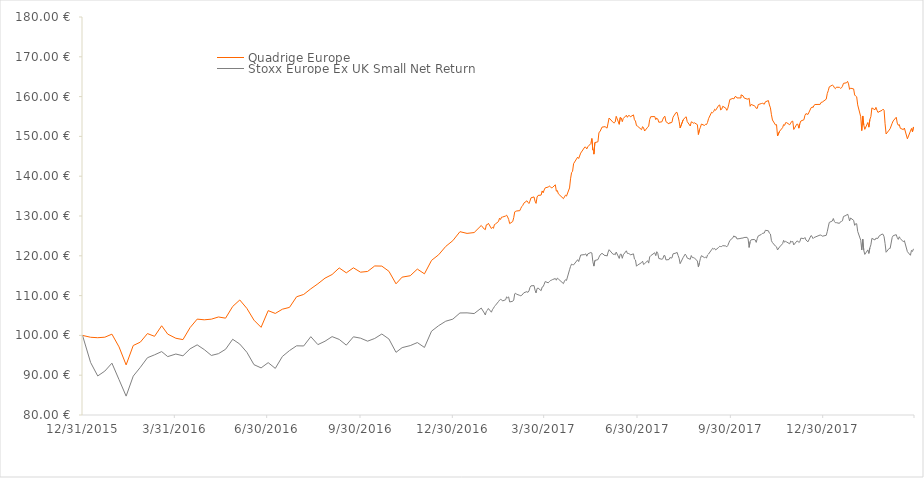
| Category |  Quadrige Europe     |  Stoxx Europe Ex UK Small Net Return  |
|---|---|---|
| 12/31/15 | 100 | 100 |
| 1/8/16 | 99.53 | 93.186 |
| 1/15/16 | 99.42 | 89.81 |
| 1/22/16 | 99.55 | 91.035 |
| 1/29/16 | 100.31 | 93.024 |
| 2/5/16 | 97.11 | 88.883 |
| 2/12/16 | 92.59 | 84.746 |
| 2/19/16 | 97.46 | 89.771 |
| 2/26/16 | 98.31 | 91.98 |
| 3/4/16 | 100.46 | 94.39 |
| 3/11/16 | 99.77 | 95.116 |
| 3/18/16 | 102.42 | 95.935 |
| 3/24/16 | 100.32 | 94.673 |
| 4/1/16 | 99.28 | 95.319 |
| 4/8/16 | 98.94 | 94.872 |
| 4/15/16 | 101.95 | 96.62 |
| 4/22/16 | 104.09 | 97.627 |
| 4/29/16 | 103.92 | 96.434 |
| 5/6/16 | 104.08 | 94.964 |
| 5/13/16 | 104.63 | 95.412 |
| 5/20/16 | 104.33 | 96.51 |
| 5/27/16 | 107.27 | 99.025 |
| 6/3/16 | 108.9 | 97.822 |
| 6/10/16 | 106.78 | 95.755 |
| 6/17/16 | 103.83 | 92.646 |
| 6/24/16 | 102.03 | 91.833 |
| 7/1/16 | 106.22 | 93.156 |
| 7/8/16 | 105.52 | 91.714 |
| 7/15/16 | 106.58 | 94.707 |
| 7/22/16 | 107.04 | 96.186 |
| 7/29/16 | 109.71 | 97.385 |
| 8/5/16 | 110.29 | 97.348 |
| 8/12/16 | 111.7 | 99.682 |
| 8/19/16 | 112.97 | 97.683 |
| 8/26/16 | 114.38 | 98.537 |
| 9/2/16 | 115.3 | 99.693 |
| 9/9/16 | 116.95 | 98.993 |
| 9/16/16 | 115.72 | 97.554 |
| 9/23/16 | 116.98 | 99.646 |
| 9/30/16 | 115.88 | 99.306 |
| 10/7/16 | 116.07 | 98.55 |
| 10/14/16 | 117.45 | 99.231 |
| 10/21/16 | 117.41 | 100.348 |
| 10/28/16 | 116.11 | 99.094 |
| 11/4/16 | 112.96 | 95.749 |
| 11/10/16 | 114.64 | 96.922 |
| 11/18/16 | 114.99 | 97.437 |
| 11/25/16 | 116.66 | 98.2 |
| 12/2/16 | 115.47 | 96.974 |
| 12/9/16 | 118.85 | 101.063 |
| 12/16/16 | 120.26 | 102.444 |
| 12/23/16 | 122.36 | 103.564 |
| 12/30/16 | 123.81 | 104.089 |
| 1/6/17 | 126.06 | 105.639 |
| 1/13/17 | 125.63 | 105.667 |
| 1/20/17 | 125.84 | 105.481 |
| 1/27/17 | 127.62 | 106.868 |
| 1/30/17 | 126.7 | 105.623 |
| 1/31/17 | 126.57 | 105.126 |
| 2/1/17 | 127.78 | 106.058 |
| 2/2/17 | 127.81 | 106.291 |
| 2/3/17 | 128.17 | 106.762 |
| 2/6/17 | 126.85 | 105.827 |
| 2/7/17 | 127.16 | 106.445 |
| 2/8/17 | 126.91 | 106.819 |
| 2/9/17 | 127.85 | 107.249 |
| 2/10/17 | 128 | 107.558 |
| 2/13/17 | 128.62 | 108.502 |
| 2/14/17 | 129.45 | 108.857 |
| 2/15/17 | 129.13 | 109.04 |
| 2/16/17 | 129.71 | 108.969 |
| 2/17/17 | 129.74 | 108.658 |
| 2/20/17 | 130 | 108.958 |
| 2/21/17 | 130.21 | 109.684 |
| 2/22/17 | 129.76 | 109.459 |
| 2/23/17 | 129.15 | 109.671 |
| 2/24/17 | 128.09 | 108.407 |
| 2/27/17 | 128.61 | 108.57 |
| 2/28/17 | 129.59 | 108.9 |
| 3/1/17 | 131.04 | 110.46 |
| 3/2/17 | 131.18 | 110.56 |
| 3/3/17 | 131.27 | 110.33 |
| 3/6/17 | 131.34 | 110.05 |
| 3/7/17 | 131.94 | 109.95 |
| 3/8/17 | 132.4 | 110.1 |
| 3/9/17 | 132.69 | 110.4 |
| 3/10/17 | 133.23 | 110.71 |
| 3/13/17 | 133.82 | 111 |
| 3/14/17 | 133.45 | 110.8 |
| 3/15/17 | 133.14 | 111.16 |
| 3/16/17 | 133.75 | 112.04 |
| 3/17/17 | 134.56 | 112.45 |
| 3/20/17 | 134.8 | 112.52 |
| 3/21/17 | 133.73 | 111.36 |
| 3/22/17 | 133.17 | 110.66 |
| 3/23/17 | 134.76 | 111.78 |
| 3/24/17 | 135.17 | 111.89 |
| 3/27/17 | 135.25 | 111.24 |
| 3/28/17 | 136.3 | 112.14 |
| 3/29/17 | 135.83 | 112.25 |
| 3/30/17 | 136.54 | 112.84 |
| 3/31/17 | 137.07 | 113.53 |
| 4/3/17 | 137.28 | 113.21 |
| 4/4/17 | 137.52 | 113.49 |
| 4/5/17 | 137.4 | 113.75 |
| 4/6/17 | 137.08 | 113.85 |
| 4/7/17 | 137.12 | 114 |
| 4/10/17 | 137.84 | 114.29 |
| 4/11/17 | 136.25 | 113.87 |
| 4/12/17 | 136.38 | 114.4 |
| 4/13/17 | 135.57 | 114.17 |
| 4/18/17 | 134.36 | 113.01 |
| 4/19/17 | 134.8 | 113.64 |
| 4/20/17 | 135.23 | 113.99 |
| 4/21/17 | 135 | 113.81 |
| 4/24/17 | 137.05 | 116.49 |
| 4/25/17 | 139.34 | 117.33 |
| 4/26/17 | 140.88 | 117.91 |
| 4/27/17 | 141.24 | 117.78 |
| 4/28/17 | 143.14 | 117.72 |
| 5/2/17 | 144.79 | 119.02 |
| 5/3/17 | 144.45 | 118.56 |
| 5/5/17 | 145.8 | 120.19 |
| 5/9/17 | 147.32 | 120.31 |
| 5/10/17 | 147.28 | 120.49 |
| 5/11/17 | 146.85 | 119.9 |
| 5/12/17 | 147.39 | 120.47 |
| 5/15/17 | 148.21 | 120.83 |
| 5/16/17 | 149.47 | 120.71 |
| 5/17/17 | 146.55 | 118.52 |
| 5/17/17 | 146.55 | 118.52 |
| 5/18/17 | 146.55 | 117.41 |
| 5/18/17 | 146.55 | 117.41 |
| 5/18/17 | 145.54 | 117.41 |
| 5/19/17 | 148.45 | 118.82 |
| 5/22/17 | 148.65 | 119.04 |
| 5/23/17 | 151 | 119.65 |
| 5/24/17 | 151.19 | 120.17 |
| 5/26/17 | 152.33 | 120.63 |
| 5/29/17 | 152.45 | 120.01 |
| 5/30/17 | 152.26 | 120.15 |
| 5/31/17 | 152.08 | 119.9 |
| 6/1/17 | 153.35 | 120.89 |
| 6/2/17 | 154.62 | 121.53 |
| 6/6/17 | 153.5 | 120.35 |
| 6/7/17 | 153.38 | 120.46 |
| 6/8/17 | 153.63 | 120.25 |
| 6/9/17 | 155.05 | 120.94 |
| 6/12/17 | 153.04 | 119.34 |
| 6/13/17 | 154.75 | 120.4 |
| 6/14/17 | 154.63 | 120.39 |
| 6/15/17 | 153.7 | 119.37 |
| 6/16/17 | 154.51 | 120.25 |
| 6/19/17 | 155.31 | 121.26 |
| 6/20/17 | 154.8 | 120.61 |
| 6/21/17 | 155.22 | 120.58 |
| 6/22/17 | 155.25 | 120.53 |
| 6/23/17 | 154.92 | 120.22 |
| 6/26/17 | 155.41 | 120.49 |
| 6/27/17 | 154.18 | 119.17 |
| 6/28/17 | 153.86 | 118.95 |
| 6/29/17 | 152.71 | 117.38 |
| 6/30/17 | 152.57 | 117.64 |
| 7/4/17 | 151.69 | 118.29 |
| 7/5/17 | 152.45 | 118.64 |
| 7/6/17 | 152.12 | 117.81 |
| 7/7/17 | 151.35 | 118 |
| 7/10/17 | 152.31 | 118.78 |
| 7/11/17 | 152.59 | 118.16 |
| 7/12/17 | 154.25 | 119.74 |
| 7/13/17 | 154.95 | 120.02 |
| 7/17/17 | 154.99 | 120.77 |
| 7/18/17 | 154.21 | 120.03 |
| 7/19/17 | 154.6 | 121.03 |
| 7/20/17 | 154.36 | 120.58 |
| 7/21/17 | 153.55 | 119.33 |
| 7/24/17 | 153.66 | 119.13 |
| 7/25/17 | 154.34 | 119.28 |
| 7/26/17 | 154.85 | 120.06 |
| 7/27/17 | 155.06 | 120.04 |
| 7/28/17 | 153.71 | 118.97 |
| 7/31/17 | 153.13 | 119.05 |
| 8/1/17 | 153.55 | 119.59 |
| 8/2/17 | 153.32 | 119.43 |
| 8/3/17 | 153.6 | 119.49 |
| 8/4/17 | 154.83 | 120.49 |
| 8/7/17 | 156.02 | 120.7 |
| 8/8/17 | 156.01 | 120.87 |
| 8/9/17 | 154.97 | 120.07 |
| 8/10/17 | 153.8 | 119.38 |
| 8/11/17 | 152.12 | 118.02 |
| 8/14/17 | 154.15 | 119.57 |
| 8/16/17 | 154.77 | 120.42 |
| 8/17/17 | 154.91 | 120.07 |
| 8/18/17 | 153.71 | 119.43 |
| 8/21/17 | 152.61 | 119.12 |
| 8/22/17 | 153.66 | 120.06 |
| 8/23/17 | 153.58 | 119.56 |
| 8/24/17 | 153.3 | 119.54 |
| 8/25/17 | 153.43 | 119.49 |
| 8/28/17 | 152.95 | 118.68 |
| 8/29/17 | 150.48 | 117.18 |
| 8/30/17 | 151.64 | 118.24 |
| 8/31/17 | 152.3 | 119.34 |
| 9/1/17 | 153.1 | 120.03 |
| 9/4/17 | 152.74 | 119.54 |
| 9/5/17 | 153.04 | 119.63 |
| 9/6/17 | 152.97 | 119.44 |
| 9/7/17 | 153.51 | 120.19 |
| 9/8/17 | 154.45 | 120.44 |
| 9/11/17 | 156.07 | 121.51 |
| 9/12/17 | 155.96 | 121.89 |
| 9/13/17 | 156.21 | 121.71 |
| 9/14/17 | 156.81 | 121.85 |
| 9/15/17 | 156.56 | 121.48 |
| 9/18/17 | 157.79 | 122.11 |
| 9/19/17 | 157.9 | 122.39 |
| 9/20/17 | 156.63 | 122.32 |
| 9/21/17 | 156.84 | 122.34 |
| 9/22/17 | 157.57 | 122.55 |
| 9/25/17 | 157.1 | 122.47 |
| 9/26/17 | 156.55 | 122.26 |
| 9/27/17 | 157.08 | 122.6 |
| 9/28/17 | 158.11 | 123.25 |
| 9/29/17 | 159.27 | 123.85 |
| 10/2/17 | 159.55 | 124.53 |
| 10/3/17 | 159.42 | 125.02 |
| 10/4/17 | 159.95 | 124.7 |
| 10/5/17 | 160.04 | 124.81 |
| 10/6/17 | 159.66 | 124.24 |
| 10/9/17 | 159.67 | 124.33 |
| 10/10/17 | 159.65 | 124.41 |
| 10/10/17 | 160.44 | 124.5 |
| 10/12/17 | 160.2 | 124.47 |
| 10/13/17 | 159.67 | 124.6 |
| 10/16/17 | 159.38 | 124.64 |
| 10/17/17 | 159.36 | 124.24 |
| 10/18/17 | 159.6 | 122.11 |
| 10/19/17 | 157.56 | 123.58 |
| 10/20/17 | 158.03 | 124.03 |
| 10/23/17 | 157.71 | 124.1 |
| 10/24/17 | 157.53 | 123.98 |
| 10/25/17 | 157.06 | 123.37 |
| 10/26/17 | 157.04 | 124.33 |
| 10/27/17 | 158 | 125 |
| 10/30/17 | 158.25 | 125.36 |
| 10/31/17 | 158.34 | 125.62 |
| 11/2/17 | 158.1 | 125.74 |
| 11/3/17 | 158.69 | 126.41 |
| 11/6/17 | 159 | 126.29 |
| 11/7/17 | 157.89 | 125.67 |
| 11/8/17 | 157.18 | 125.47 |
| 11/9/17 | 155.44 | 123.79 |
| 11/10/17 | 154.12 | 123.32 |
| 11/13/17 | 152.87 | 122.42 |
| 11/14/17 | 152.96 | 122.25 |
| 11/15/17 | 150.11 | 121.47 |
| 11/17/17 | 151.28 | 122.21 |
| 11/20/17 | 152.2 | 123.05 |
| 11/21/17 | 152.96 | 123.89 |
| 11/22/17 | 152.78 | 123.41 |
| 11/23/17 | 153.46 | 123.64 |
| 11/24/17 | 153.45 | 123.47 |
| 11/27/17 | 152.92 | 123.01 |
| 11/28/17 | 153.34 | 123.71 |
| 11/29/17 | 153.77 | 123.49 |
| 11/30/17 | 153.83 | 123.6 |
| 12/1/17 | 151.74 | 122.74 |
| 12/4/17 | 153.07 | 123.68 |
| 12/5/17 | 153.06 | 123.7 |
| 12/6/17 | 152.07 | 123.34 |
| 12/7/17 | 153.22 | 123.55 |
| 12/8/17 | 153.87 | 124.44 |
| 12/11/17 | 154.18 | 124.3 |
| 12/12/17 | 155.28 | 124.6 |
| 12/13/17 | 155.73 | 123.97 |
| 12/15/17 | 155.52 | 123.51 |
| 12/18/17 | 157.15 | 125.08 |
| 12/19/17 | 157.42 | 124.89 |
| 12/20/17 | 157.24 | 124.33 |
| 12/21/17 | 157.82 | 124.59 |
| 12/22/17 | 158.01 | 124.7 |
| 12/27/17 | 158.05 | 125.23 |
| 12/28/17 | 158.56 | 125.17 |
| 12/29/17 | 158.6 | 124.92 |
| 1/2/18 | 159.35 | 125.14 |
| 1/3/18 | 160.75 | 126.06 |
| 1/4/18 | 161.48 | 127.25 |
| 1/5/18 | 162.45 | 128.39 |
| 1/5/18 | 162.45 | 128.39 |
| 1/8/18 | 162.89 | 128.75 |
| 1/9/18 | 162.74 | 129.37 |
| 1/10/18 | 162.23 | 128.64 |
| 1/11/18 | 161.99 | 128.32 |
| 1/12/18 | 162.36 | 128.33 |
| 1/15/18 | 162.33 | 128.15 |
| 1/16/18 | 162.08 | 128.54 |
| 1/17/18 | 162.2 | 128.64 |
| 1/18/18 | 162.6 | 128.79 |
| 1/19/18 | 163.33 | 129.88 |
| 1/22/18 | 163.47 | 130.19 |
| 1/23/18 | 163.83 | 130.51 |
| 1/24/18 | 163.19 | 129.82 |
| 1/25/18 | 161.82 | 128.76 |
| 1/26/18 | 162.11 | 129.49 |
| 1/29/18 | 161.93 | 128.91 |
| 1/30/18 | 160.41 | 127.65 |
| 1/31/18 | 160.13 | 128.06 |
| 2/1/18 | 159.95 | 128.05 |
| 2/2/18 | 157.92 | 126.13 |
| 2/5/18 | 154.94 | 123.92 |
| 2/6/18 | 151.47 | 121.47 |
| 2/7/18 | 155.13 | 124.17 |
| 2/8/18 | 152.87 | 121.38 |
| 2/9/18 | 151.77 | 120.35 |
| 2/12/18 | 153.49 | 121.49 |
| 2/13/18 | 152.32 | 120.6 |
| 2/14/18 | 154.25 | 121.99 |
| 2/15/18 | 154.98 | 122.76 |
| 2/16/18 | 157.16 | 124.38 |
| 2/19/18 | 156.69 | 123.98 |
| 2/20/18 | 157.3 | 124.44 |
| 2/21/18 | 156.58 | 124.37 |
| 2/22/18 | 156.01 | 124.4 |
| 2/23/18 | 156.2 | 124.94 |
| 2/26/18 | 156.54 | 125.45 |
| 2/27/18 | 156.85 | 125.41 |
| 2/28/18 | 156.59 | 124.8 |
| 3/1/18 | 153.18 | 123.08 |
| 3/2/18 | 150.61 | 120.89 |
| 3/5/18 | 151.59 | 121.86 |
| 3/5/18 | 151.59 | 121.86 |
| 3/6/18 | 151.94 | 121.86 |
| 3/8/18 | 153.31 | 124.6 |
| 3/9/18 | 153.89 | 125.06 |
| 3/12/18 | 154.81 | 125.31 |
| 3/13/18 | 153.34 | 124.56 |
| 3/14/18 | 152.8 | 124.12 |
| 3/15/18 | 152.98 | 124.78 |
| 3/16/18 | 152.04 | 124.33 |
| 3/19/18 | 151.71 | 123.52 |
| 3/20/18 | 152.11 | 123.8 |
| 3/23/18 | 149.39 | 121.04 |
| 3/26/18 | 151.33 | 120.13 |
| 3/27/18 | 152 | 121.36 |
| 3/28/18 | 151.14 | 121.09 |
| 3/29/18 | 152.37 | 121.75 |